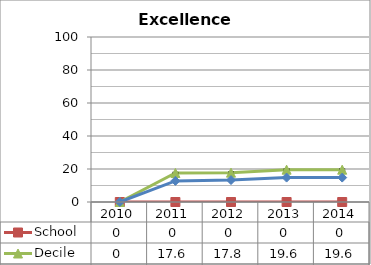
| Category | School  | Decile | National |
|---|---|---|---|
| 2010.0 | 0 | 0 | 0 |
| 2011.0 | 0 | 17.6 | 12.8 |
| 2012.0 | 0 | 17.8 | 13.3 |
| 2013.0 | 0 | 19.6 | 14.8 |
| 2014.0 | 0 | 19.6 | 14.8 |